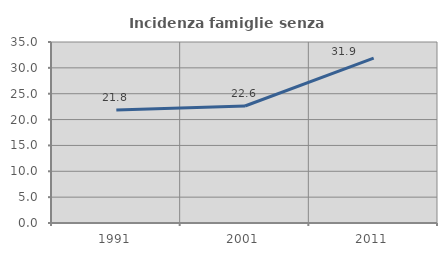
| Category | Incidenza famiglie senza nuclei |
|---|---|
| 1991.0 | 21.836 |
| 2001.0 | 22.626 |
| 2011.0 | 31.897 |